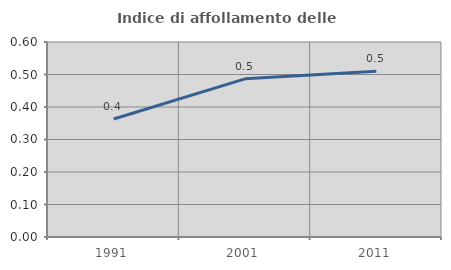
| Category | Indice di affollamento delle abitazioni  |
|---|---|
| 1991.0 | 0.363 |
| 2001.0 | 0.487 |
| 2011.0 | 0.51 |